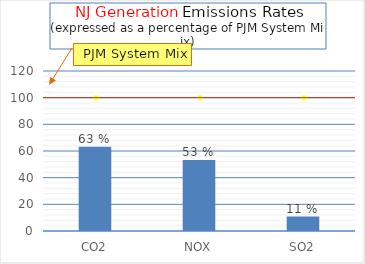
| Category | NJ Generation (%)  |
|---|---|
| CO2 | 63.107 |
| NOX | 53.226 |
| SO2 | 10.811 |